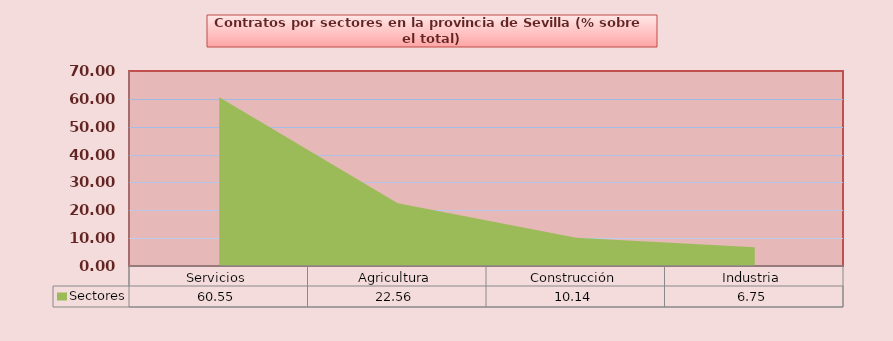
| Category | Sectores |
|---|---|
| Servicios | 60.546 |
| Agricultura | 22.558 |
| Construcción | 10.142 |
| Industria | 6.754 |